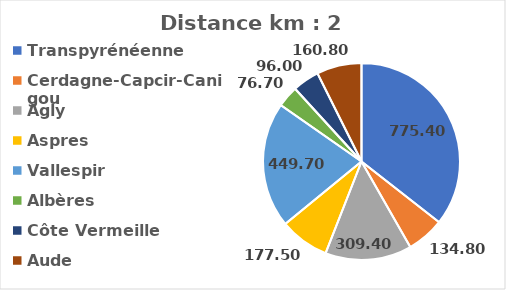
| Category | Distance km |
|---|---|
| Transpyrénéenne | 775.4 |
| Cerdagne-Capcir-Canigou | 134.8 |
| Agly | 309.4 |
| Aspres | 177.5 |
| Vallespir | 449.7 |
| Albères | 76.7 |
| Côte Vermeille | 96 |
| Aude | 160.8 |